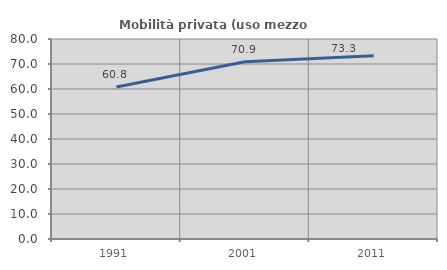
| Category | Mobilità privata (uso mezzo privato) |
|---|---|
| 1991.0 | 60.818 |
| 2001.0 | 70.869 |
| 2011.0 | 73.348 |